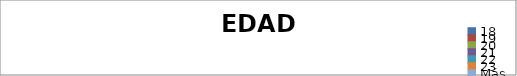
| Category | Edad |
|---|---|
| 18 | 0 |
| 19 | 0 |
| 20 | 0 |
| 21 | 0 |
| 22 | 0 |
| 23 | 0 |
| Más | 0 |